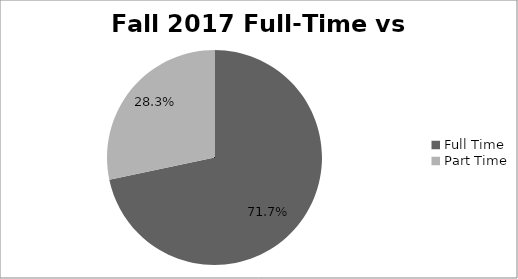
| Category | Series 0 |
|---|---|
| Full Time | 0.717 |
| Part Time | 0.283 |